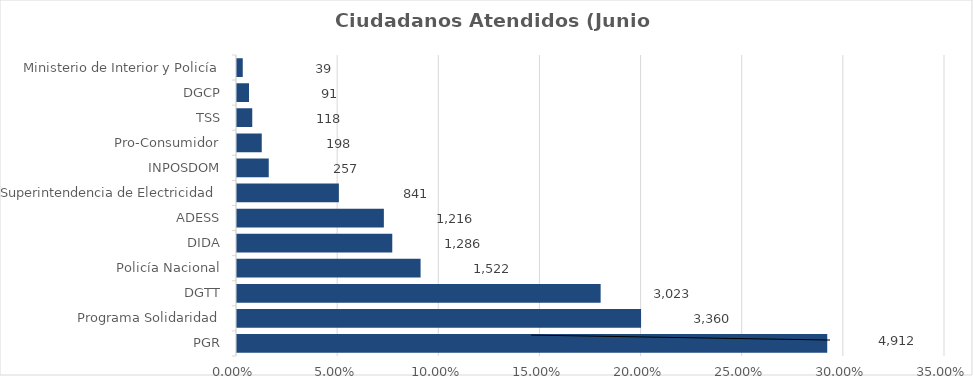
| Category | Porcentaje |
|---|---|
| PGR | 0.291 |
| Programa Solidaridad | 0.199 |
| DGTT | 0.179 |
| Policía Nacional | 0.09 |
| DIDA | 0.076 |
| ADESS | 0.072 |
| Superintendencia de Electricidad | 0.05 |
| INPOSDOM | 0.015 |
| Pro-Consumidor | 0.012 |
| TSS | 0.007 |
| DGCP | 0.005 |
| Ministerio de Interior y Policía | 0.002 |